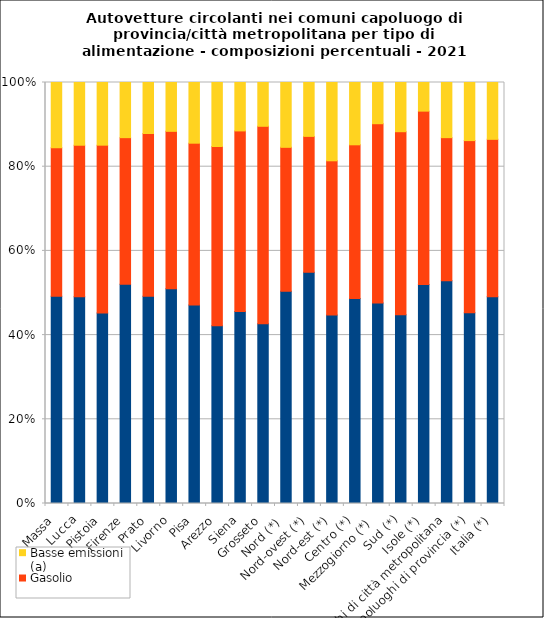
| Category | Benzina | Gasolio | Basse emissioni (a) |
|---|---|---|---|
| Massa | 49.2 | 35.3 | 15.5 |
| Lucca | 49.1 | 36 | 14.9 |
| Pistoia | 45.3 | 39.9 | 14.9 |
| Firenze | 52.1 | 34.8 | 13.1 |
| Prato | 49.2 | 38.6 | 12.1 |
| Livorno | 51 | 37.4 | 11.6 |
| Pisa | 47.1 | 38.4 | 14.4 |
| Arezzo | 42.2 | 42.6 | 15.2 |
| Siena | 45.6 | 42.9 | 11.5 |
| Grosseto | 42.7 | 46.9 | 10.4 |
| Nord (*)  | 50.4 | 34.2 | 15.4 |
| Nord-ovest (*) | 54.9 | 32.3 | 12.8 |
| Nord-est (*) | 44.8 | 36.6 | 18.6 |
| Centro (*) | 48.7 | 36.5 | 14.8 |
| Mezzogiorno (*)  | 47.7 | 42.6 | 9.8 |
| Sud (*) | 44.9 | 43.5 | 11.7 |
| Isole (*) | 52 | 41.2 | 6.8 |
| Capoluoghi di città metropolitana | 52.9 | 34 | 13.1 |
| Capoluoghi di provincia (*) | 45.3 | 40.9 | 13.8 |
| Italia (*) | 49.1 | 37.4 | 13.5 |